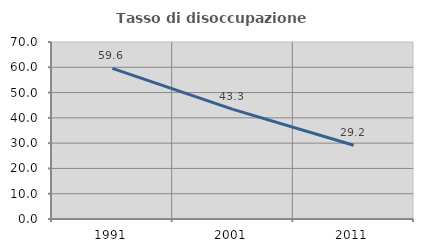
| Category | Tasso di disoccupazione giovanile  |
|---|---|
| 1991.0 | 59.574 |
| 2001.0 | 43.333 |
| 2011.0 | 29.167 |